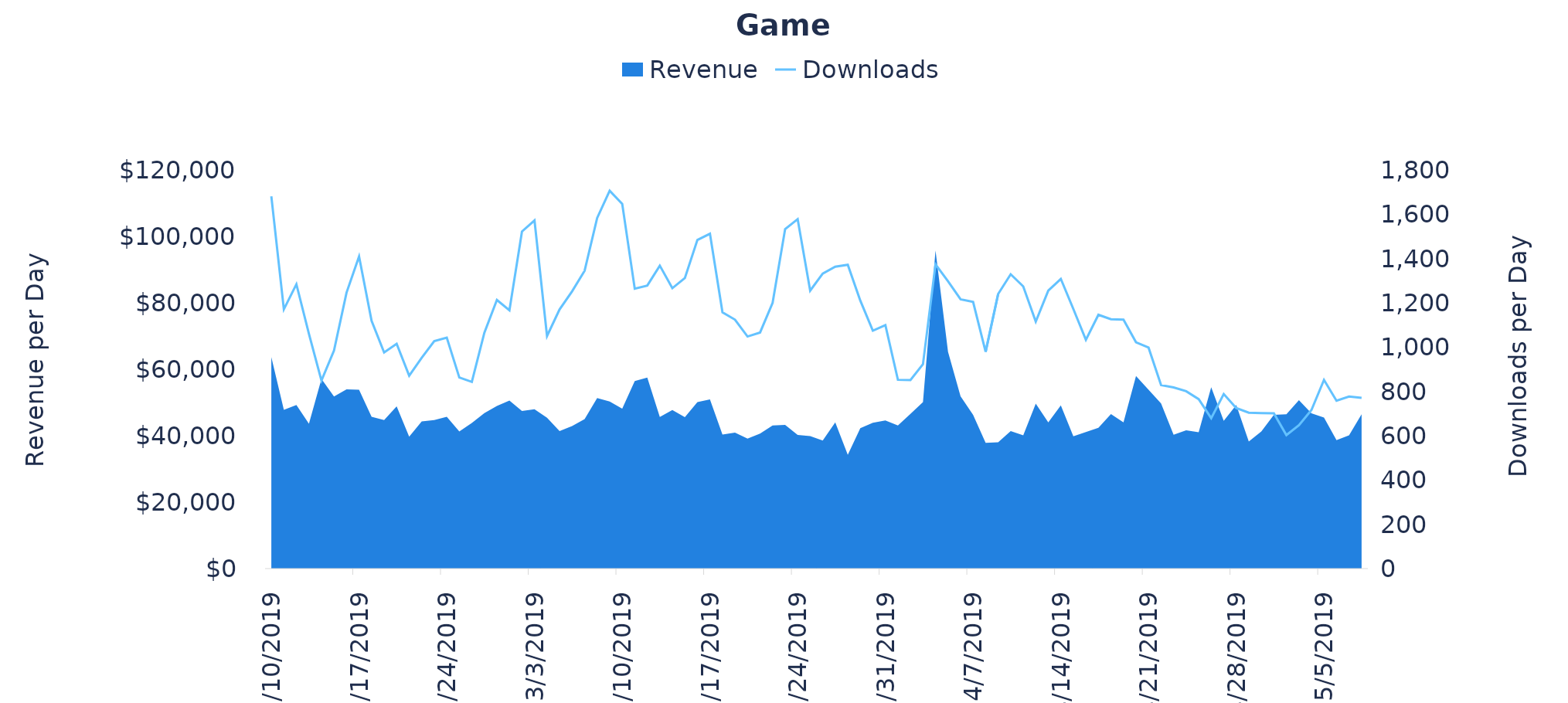
| Category | Downloads |
|---|---|
| 2/10/19 | 1681 |
| 2/11/19 | 1171 |
| 2/12/19 | 1284 |
| 2/13/19 | 1060 |
| 2/14/19 | 849 |
| 2/15/19 | 984 |
| 2/16/19 | 1246 |
| 2/17/19 | 1409 |
| 2/18/19 | 1119 |
| 2/19/19 | 976 |
| 2/20/19 | 1015 |
| 2/21/19 | 871 |
| 2/22/19 | 952 |
| 2/23/19 | 1027 |
| 2/24/19 | 1043 |
| 2/25/19 | 863 |
| 2/26/19 | 843 |
| 2/27/19 | 1065 |
| 2/28/19 | 1213 |
| 3/1/19 | 1166 |
| 3/2/19 | 1522 |
| 3/3/19 | 1572 |
| 3/4/19 | 1050 |
| 3/5/19 | 1170 |
| 3/6/19 | 1252 |
| 3/7/19 | 1345 |
| 3/8/19 | 1583 |
| 3/9/19 | 1706 |
| 3/10/19 | 1647 |
| 3/11/19 | 1264 |
| 3/12/19 | 1278 |
| 3/13/19 | 1368 |
| 3/14/19 | 1266 |
| 3/15/19 | 1312 |
| 3/16/19 | 1484 |
| 3/17/19 | 1512 |
| 3/18/19 | 1157 |
| 3/19/19 | 1124 |
| 3/20/19 | 1048 |
| 3/21/19 | 1066 |
| 3/22/19 | 1200 |
| 3/23/19 | 1533 |
| 3/24/19 | 1578 |
| 3/25/19 | 1255 |
| 3/26/19 | 1332 |
| 3/27/19 | 1363 |
| 3/28/19 | 1372 |
| 3/29/19 | 1210 |
| 3/30/19 | 1074 |
| 3/31/19 | 1099 |
| 4/1/19 | 853 |
| 4/2/19 | 851 |
| 4/3/19 | 923 |
| 4/4/19 | 1374 |
| 4/5/19 | 1297 |
| 4/6/19 | 1216 |
| 4/7/19 | 1204 |
| 4/8/19 | 979 |
| 4/9/19 | 1240 |
| 4/10/19 | 1329 |
| 4/11/19 | 1274 |
| 4/12/19 | 1115 |
| 4/13/19 | 1255 |
| 4/14/19 | 1308 |
| 4/15/19 | 1172 |
| 4/16/19 | 1033 |
| 4/17/19 | 1146 |
| 4/18/19 | 1126 |
| 4/19/19 | 1124 |
| 4/20/19 | 1022 |
| 4/21/19 | 998 |
| 4/22/19 | 829 |
| 4/23/19 | 818 |
| 4/24/19 | 801 |
| 4/25/19 | 765 |
| 4/26/19 | 679 |
| 4/27/19 | 788 |
| 4/28/19 | 725 |
| 4/29/19 | 704 |
| 4/30/19 | 702 |
| 5/1/19 | 701 |
| 5/2/19 | 603 |
| 5/3/19 | 647 |
| 5/4/19 | 716 |
| 5/5/19 | 852 |
| 5/6/19 | 758 |
| 5/7/19 | 777 |
| 5/8/19 | 771 |